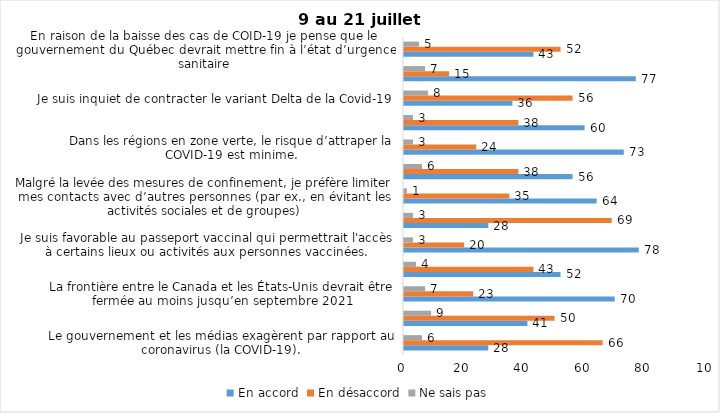
| Category | En accord | En désaccord | Ne sais pas |
|---|---|---|---|
| Le gouvernement et les médias exagèrent par rapport au coronavirus (la COVID-19). | 28 | 66 | 6 |
| J’ai peur que le système de santé soit débordé par les cas de COVID-19 suite au "déconfinement" | 41 | 50 | 9 |
| La frontière entre le Canada et les États-Unis devrait être fermée au moins jusqu’en septembre 2021 | 70 | 23 | 7 |
| Les personnes vaccinées contre la COVID-19 devraient avoir le droit de faire des rassemblements privés et de ne plus porter le masque dans les lieux publics. | 52 | 43 | 4 |
| Je suis favorable au passeport vaccinal qui permettrait l'accès à certains lieux ou activités aux personnes vaccinées. | 78 | 20 | 3 |
| Étant donné la progression de la vaccination et la diminution du nombre de cas de COVID-19, je pense qu’il est moins important de suivre les mesures de prévention. | 28 | 69 | 3 |
| Malgré la levée des mesures de confinement, je préfère limiter mes contacts avec d’autres personnes (par ex., en évitant les activités sociales et de groupes) | 64 | 35 | 1 |
| J’ai peur qu’il y ait une 4e vague de la COVID-19. | 56 | 38 | 6 |
| Dans les régions en zone verte, le risque d’attraper la COVID-19 est minime. | 73 | 24 | 3 |
| Si les cas de COVID-19 augmentent cet automne, je suis favorable à la mise en place de mesures de confinement (ex. fermeture de services non essentiels, interdiction des rassemblements privés) | 60 | 38 | 3 |
| Je suis inquiet de contracter le variant Delta de la Covid-19 | 36 | 56 | 8 |
| Je suis confiant que la vaccination protège efficacement contre les variants de la COVID-19 | 77 | 15 | 7 |
| En raison de la baisse des cas de COID-19 je pense que le gouvernement du Québec devrait mettre fin à l’état d’urgence sanitaire | 43 | 52 | 5 |